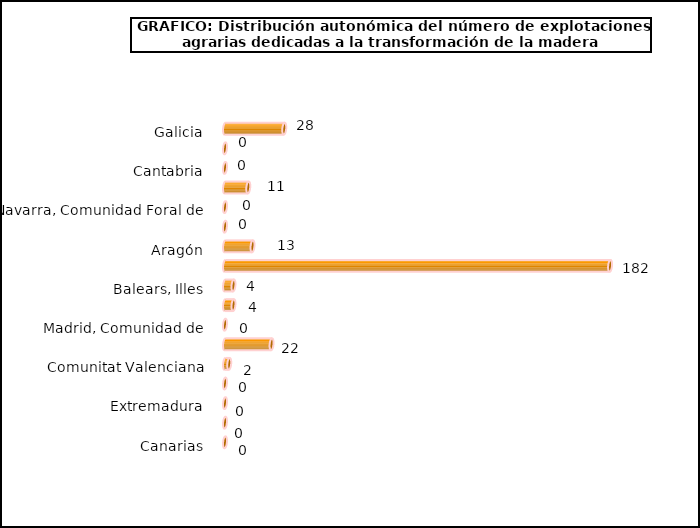
| Category | num. Explotaciones |
|---|---|
| Galicia | 28 |
| Asturias, Principado de | 0 |
| Cantabria | 0 |
| País Vasco | 11 |
| Navarra, Comunidad Foral de | 0 |
| Rioja, La | 0 |
| Aragón | 13 |
| Cataluña | 182 |
| Balears, Illes | 4 |
| Castilla y León | 4 |
| Madrid, Comunidad de | 0 |
| Castilla - La Mancha | 22 |
| Comunitat Valenciana | 2 |
| Murcia, Región de | 0 |
| Extremadura | 0 |
| Andalucía | 0 |
| Canarias | 0 |